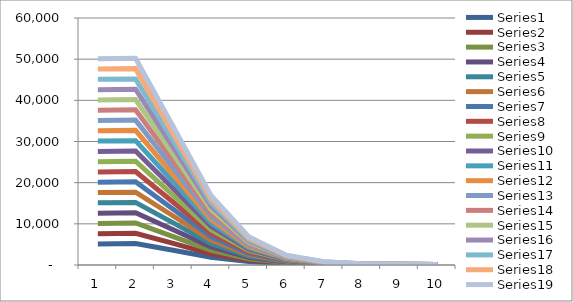
| Category | Series 0 | Series 1 | Series 2 | Series 3 | Series 4 | Series 5 | Series 6 | Series 7 | Series 8 | Series 9 | Series 10 | Series 11 | Series 12 | Series 13 | Series 14 | Series 15 | Series 16 | Series 17 | Series 18 |
|---|---|---|---|---|---|---|---|---|---|---|---|---|---|---|---|---|---|---|---|
| 0 | 5100 | 7600 | 10100 | 12600 | 15100 | 17600 | 20100 | 22600 | 25100 | 27600 | 30100 | 32600 | 35100 | 37600 | 40100 | 42600 | 45100 | 47600 | 50100 |
| 1 | 5200 | 7700 | 10200 | 12700 | 15200 | 17700 | 20200 | 22700 | 25200 | 27700 | 30200 | 32700 | 35200 | 37700 | 40200 | 42700 | 45200 | 47700 | 50200 |
| 2 | 3566.667 | 5233.333 | 6900 | 8566.667 | 10233.333 | 11900 | 13566.667 | 15233.333 | 16900 | 18566.667 | 20233.333 | 21900 | 23566.667 | 25233.333 | 26900 | 28566.667 | 30233.333 | 31900 | 33566.667 |
| 3 | 1883.333 | 2716.667 | 3550 | 4383.333 | 5216.667 | 6050 | 6883.333 | 7716.667 | 8550 | 9383.333 | 10216.667 | 11050 | 11883.333 | 12716.667 | 13550 | 14383.333 | 15216.667 | 16050 | 16883.333 |
| 4 | 853.333 | 1186.667 | 1520 | 1853.333 | 2186.667 | 2520 | 2853.333 | 3186.667 | 3520 | 3853.333 | 4186.667 | 4520 | 4853.333 | 5186.667 | 5520 | 5853.333 | 6186.667 | 6520 | 6853.333 |
| 5 | 384.444 | 495.556 | 606.667 | 717.778 | 828.889 | 940 | 1051.111 | 1162.222 | 1273.333 | 1384.444 | 1495.556 | 1606.667 | 1717.778 | 1828.889 | 1940 | 2051.111 | 2162.222 | 2273.333 | 2384.444 |
| 6 | 209.841 | 241.587 | 273.333 | 305.079 | 336.825 | 368.571 | 400.317 | 432.063 | 463.81 | 495.556 | 527.302 | 559.048 | 590.794 | 622.54 | 654.286 | 686.032 | 717.778 | 749.524 | 781.27 |
| 7 | 152.46 | 160.397 | 168.333 | 176.27 | 184.206 | 192.143 | 200.079 | 208.016 | 215.952 | 223.889 | 231.825 | 239.762 | 247.698 | 255.635 | 263.571 | 271.508 | 279.444 | 287.381 | 295.317 |
| 8 | 133.88 | 135.644 | 137.407 | 139.171 | 140.935 | 142.698 | 144.462 | 146.226 | 147.989 | 149.753 | 151.517 | 153.28 | 155.044 | 156.808 | 158.571 | 160.335 | 162.099 | 163.862 | 165.626 |
| 9 | 126.776 | 127.129 | 127.481 | 127.834 | 128.187 | 128.54 | 128.892 | 129.245 | 129.598 | 129.951 | 130.303 | 130.656 | 131.009 | 131.362 | 131.714 | 132.067 | 132.42 | 132.772 | 133.125 |